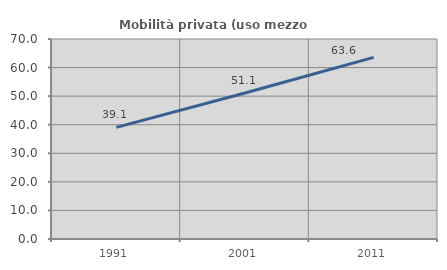
| Category | Mobilità privata (uso mezzo privato) |
|---|---|
| 1991.0 | 39.054 |
| 2001.0 | 51.111 |
| 2011.0 | 63.582 |